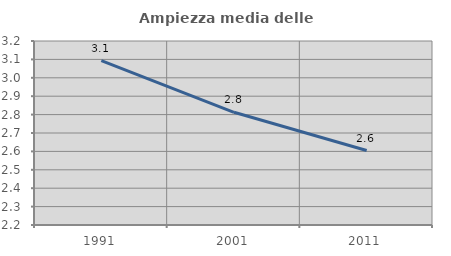
| Category | Ampiezza media delle famiglie |
|---|---|
| 1991.0 | 3.093 |
| 2001.0 | 2.813 |
| 2011.0 | 2.605 |